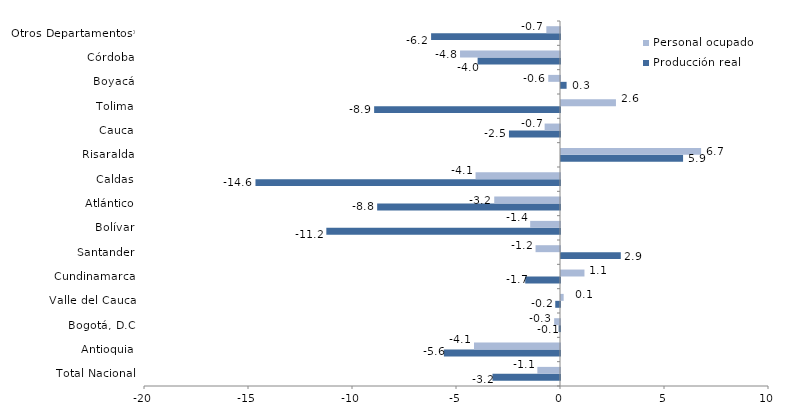
| Category | Producción real | Personal ocupado |
|---|---|---|
| Total Nacional | -3.245 | -1.088 |
| Antioquia | -5.583 | -4.136 |
| Bogotá, D.C | -0.065 | -0.281 |
| Valle del Cauca | -0.228 | 0.128 |
| Cundinamarca | -1.672 | 1.128 |
| Santander | 2.875 | -1.176 |
| Bolívar | -11.234 | -1.434 |
| Atlántico | -8.791 | -3.162 |
| Caldas | -14.64 | -4.06 |
| Risaralda | 5.869 | 6.736 |
| Cauca | -2.454 | -0.739 |
| Tolima | -8.936 | 2.641 |
| Boyacá | 0.269 | -0.564 |
| Córdoba | -3.961 | -4.806 |
| Otros Departamentos* | -6.197 | -0.657 |